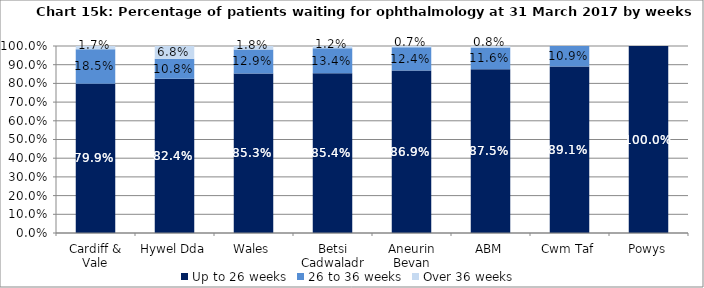
| Category | Up to 26 weeks  | 26 to 36 weeks  | Over 36 weeks  |
|---|---|---|---|
| Cardiff & Vale | 0.799 | 0.185 | 0.017 |
| Hywel Dda | 0.824 | 0.108 | 0.068 |
| Wales | 0.853 | 0.129 | 0.018 |
| Betsi Cadwaladr | 0.854 | 0.134 | 0.012 |
| Aneurin Bevan | 0.869 | 0.124 | 0.007 |
| ABM | 0.875 | 0.116 | 0.008 |
| Cwm Taf | 0.891 | 0.109 | 0 |
| Powys | 1 | 0 | 0 |